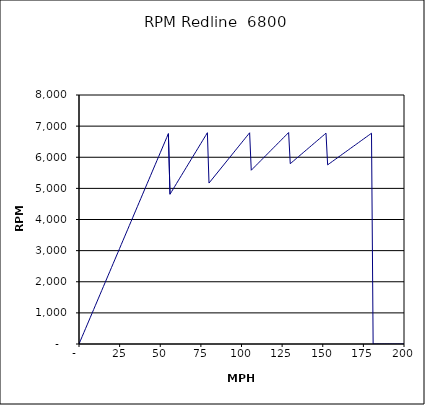
| Category | RPM Redline  6800 |
|---|---|
| 0.0 | 0 |
| 1.0 | 122.885 |
| 2.0 | 245.77 |
| 3.0 | 368.655 |
| 4.0 | 491.539 |
| 5.0 | 614.424 |
| 6.0 | 737.309 |
| 7.0 | 860.194 |
| 8.0 | 983.079 |
| 9.0 | 1105.964 |
| 10.0 | 1228.848 |
| 11.0 | 1351.733 |
| 12.0 | 1474.618 |
| 13.0 | 1597.503 |
| 14.0 | 1720.388 |
| 15.0 | 1843.273 |
| 16.0 | 1966.158 |
| 17.0 | 2089.042 |
| 18.0 | 2211.927 |
| 19.0 | 2334.812 |
| 20.0 | 2457.697 |
| 21.0 | 2580.582 |
| 22.0 | 2703.467 |
| 23.0 | 2826.351 |
| 24.0 | 2949.236 |
| 25.0 | 3072.121 |
| 26.0 | 3195.006 |
| 27.0 | 3317.891 |
| 28.0 | 3440.776 |
| 29.0 | 3563.66 |
| 30.0 | 3686.545 |
| 31.0 | 3809.43 |
| 32.0 | 3932.315 |
| 33.0 | 4055.2 |
| 34.0 | 4178.085 |
| 35.0 | 4300.97 |
| 36.0 | 4423.854 |
| 37.0 | 4546.739 |
| 38.0 | 4669.624 |
| 39.0 | 4792.509 |
| 40.0 | 4915.394 |
| 41.0 | 5038.279 |
| 42.0 | 5161.163 |
| 43.0 | 5284.048 |
| 44.0 | 5406.933 |
| 45.0 | 5529.818 |
| 46.0 | 5652.703 |
| 47.0 | 5775.588 |
| 48.0 | 5898.473 |
| 49.0 | 6021.357 |
| 50.0 | 6144.242 |
| 51.0 | 6267.127 |
| 52.0 | 6390.012 |
| 53.0 | 6512.897 |
| 54.0 | 6635.782 |
| 55.0 | 6758.666 |
| 56.0 | 4811.912 |
| 57.0 | 4897.839 |
| 58.0 | 4983.766 |
| 59.0 | 5069.693 |
| 60.0 | 5155.62 |
| 61.0 | 5241.547 |
| 62.0 | 5327.474 |
| 63.0 | 5413.401 |
| 64.0 | 5499.328 |
| 65.0 | 5585.255 |
| 66.0 | 5671.182 |
| 67.0 | 5757.109 |
| 68.0 | 5843.036 |
| 69.0 | 5928.963 |
| 70.0 | 6014.89 |
| 71.0 | 6100.817 |
| 72.0 | 6186.744 |
| 73.0 | 6272.671 |
| 74.0 | 6358.598 |
| 75.0 | 6444.525 |
| 76.0 | 6530.452 |
| 77.0 | 6616.379 |
| 78.0 | 6702.306 |
| 79.0 | 6788.233 |
| 80.0 | 5170.739 |
| 81.0 | 5235.373 |
| 82.0 | 5300.007 |
| 83.0 | 5364.642 |
| 84.0 | 5429.276 |
| 85.0 | 5493.91 |
| 86.0 | 5558.544 |
| 87.0 | 5623.179 |
| 88.0 | 5687.813 |
| 89.0 | 5752.447 |
| 90.0 | 5817.081 |
| 91.0 | 5881.715 |
| 92.0 | 5946.35 |
| 93.0 | 6010.984 |
| 94.0 | 6075.618 |
| 95.0 | 6140.252 |
| 96.0 | 6204.887 |
| 97.0 | 6269.521 |
| 98.0 | 6334.155 |
| 99.0 | 6398.789 |
| 100.0 | 6463.424 |
| 101.0 | 6528.058 |
| 102.0 | 6592.692 |
| 103.0 | 6657.326 |
| 104.0 | 6721.961 |
| 105.0 | 6786.595 |
| 106.0 | 5582.483 |
| 107.0 | 5635.148 |
| 108.0 | 5687.813 |
| 109.0 | 5740.478 |
| 110.0 | 5793.143 |
| 111.0 | 5845.808 |
| 112.0 | 5898.473 |
| 113.0 | 5951.137 |
| 114.0 | 6003.802 |
| 115.0 | 6056.467 |
| 116.0 | 6109.132 |
| 117.0 | 6161.797 |
| 118.0 | 6214.462 |
| 119.0 | 6267.127 |
| 120.0 | 6319.792 |
| 121.0 | 6372.457 |
| 122.0 | 6425.122 |
| 123.0 | 6477.787 |
| 124.0 | 6530.452 |
| 125.0 | 6583.117 |
| 126.0 | 6635.782 |
| 127.0 | 6688.447 |
| 128.0 | 6741.111 |
| 129.0 | 6793.776 |
| 130.0 | 5793.143 |
| 131.0 | 5837.705 |
| 132.0 | 5882.268 |
| 133.0 | 5926.831 |
| 134.0 | 5971.393 |
| 135.0 | 6015.956 |
| 136.0 | 6060.518 |
| 137.0 | 6105.081 |
| 138.0 | 6149.644 |
| 139.0 | 6194.206 |
| 140.0 | 6238.769 |
| 141.0 | 6283.332 |
| 142.0 | 6327.894 |
| 143.0 | 6372.457 |
| 144.0 | 6417.02 |
| 145.0 | 6461.582 |
| 146.0 | 6506.145 |
| 147.0 | 6550.707 |
| 148.0 | 6595.27 |
| 149.0 | 6639.833 |
| 150.0 | 6684.395 |
| 151.0 | 6728.958 |
| 152.0 | 6773.521 |
| 153.0 | 5755.525 |
| 154.0 | 5793.143 |
| 155.0 | 5830.76 |
| 156.0 | 5868.378 |
| 157.0 | 5905.996 |
| 158.0 | 5943.614 |
| 159.0 | 5981.232 |
| 160.0 | 6018.849 |
| 161.0 | 6056.467 |
| 162.0 | 6094.085 |
| 163.0 | 6131.703 |
| 164.0 | 6169.321 |
| 165.0 | 6206.939 |
| 166.0 | 6244.556 |
| 167.0 | 6282.174 |
| 168.0 | 6319.792 |
| 169.0 | 6357.41 |
| 170.0 | 6395.028 |
| 171.0 | 6432.645 |
| 172.0 | 6470.263 |
| 173.0 | 6507.881 |
| 174.0 | 6545.499 |
| 175.0 | 6583.117 |
| 176.0 | 6620.734 |
| 177.0 | 6658.352 |
| 178.0 | 6695.97 |
| 179.0 | 6733.588 |
| 180.0 | 6771.206 |
| 181.0 | 0 |
| 182.0 | 0 |
| 183.0 | 0 |
| 184.0 | 0 |
| 185.0 | 0 |
| 186.0 | 0 |
| 187.0 | 0 |
| 188.0 | 0 |
| 189.0 | 0 |
| 190.0 | 0 |
| 191.0 | 0 |
| 192.0 | 0 |
| 193.0 | 0 |
| 194.0 | 0 |
| 195.0 | 0 |
| 196.0 | 0 |
| 197.0 | 0 |
| 198.0 | 0 |
| 199.0 | 0 |
| 200.0 | 0 |